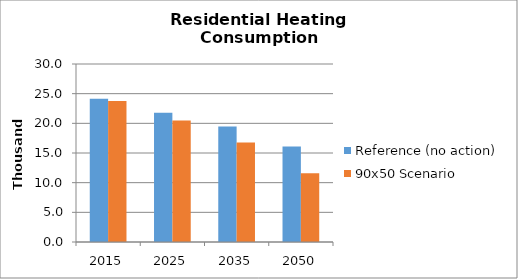
| Category | Reference (no action) | 90x50 Scenario |
|---|---|---|
| 2015.0 | 24.133 | 23.78 |
| 2025.0 | 21.774 | 20.489 |
| 2035.0 | 19.447 | 16.752 |
| 2050.0 | 16.078 | 11.573 |